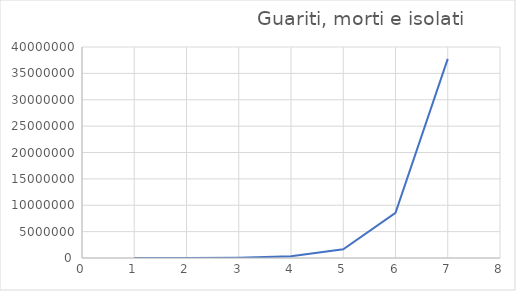
| Category | Series 0 |
|---|---|
| 1.0 | 2116 |
| 2.0 | 11233 |
| 3.0 | 59619 |
| 4.0 | 316127.142 |
| 5.0 | 1667768.88 |
| 6.0 | 8562493.466 |
| 7.0 | 37742763.693 |